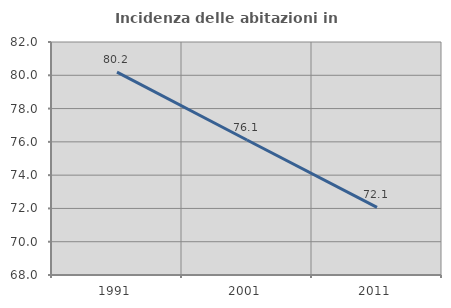
| Category | Incidenza delle abitazioni in proprietà  |
|---|---|
| 1991.0 | 80.19 |
| 2001.0 | 76.112 |
| 2011.0 | 72.066 |